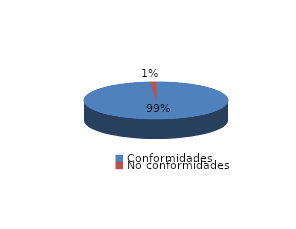
| Category | Series 0 |
|---|---|
| Conformidades | 232 |
| No conformidades | 3 |